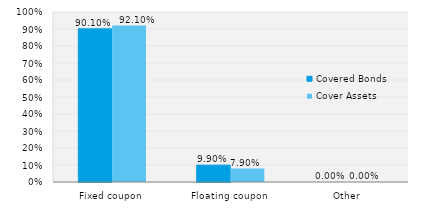
| Category | Covered Bonds | Cover Assets |
|---|---|---|
| Fixed coupon | 0.901 | 0.921 |
| Floating coupon | 0.099 | 0.079 |
| Other | 0 | 0 |